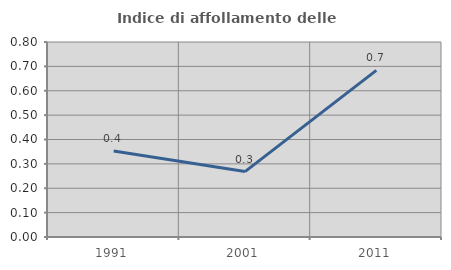
| Category | Indice di affollamento delle abitazioni  |
|---|---|
| 1991.0 | 0.353 |
| 2001.0 | 0.268 |
| 2011.0 | 0.684 |